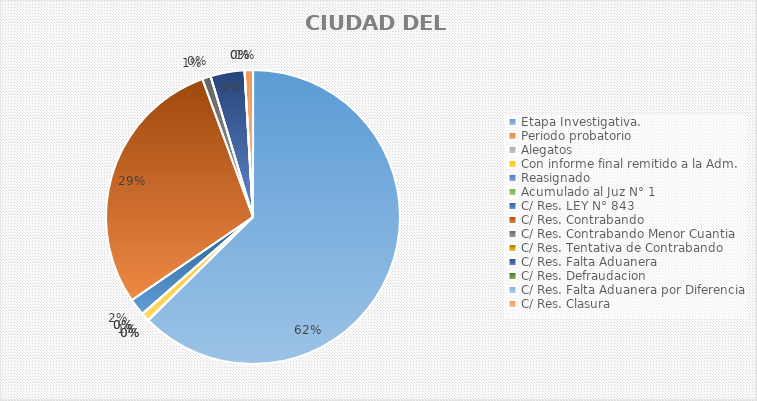
| Category | Series 1 |
|---|---|
| Etapa Investigativa. | 67 |
| Periodo probatorio | 0 |
| Alegatos | 0 |
| Con informe final remitido a la Adm. | 1 |
| Reasignado | 0 |
| Acumulado al Juz N° 1 | 0 |
| C/ Res. LEY N° 843 | 2 |
| C/ Res. Contrabando | 31 |
| C/ Res. Contrabando Menor Cuantia | 1 |
| C/ Res. Tentativa de Contrabando | 0 |
| C/ Res. Falta Aduanera | 4 |
| C/ Res. Defraudacion | 0 |
| C/ Res. Falta Aduanera por Diferencia | 0 |
| C/ Res. Clasura | 1 |